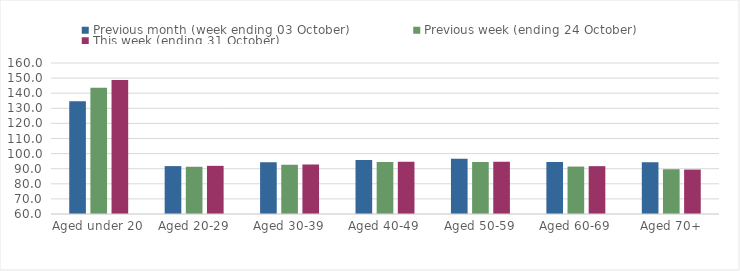
| Category | Previous month (week ending 03 October) | Previous week (ending 24 October) | This week (ending 31 October) |
|---|---|---|---|
| Aged under 20 | 134.74 | 143.56 | 148.71 |
| Aged 20-29 | 91.72 | 91.29 | 91.89 |
| Aged 30-39 | 94.25 | 92.61 | 92.79 |
| Aged 40-49 | 95.84 | 94.36 | 94.57 |
| Aged 50-59 | 96.59 | 94.42 | 94.62 |
| Aged 60-69 | 94.37 | 91.42 | 91.68 |
| Aged 70+ | 94.19 | 89.65 | 89.42 |